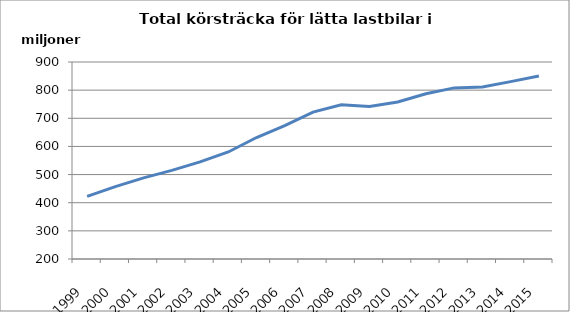
| Category | Series 0 |
|---|---|
| 1999.0 | 422257663.4 |
| 2000.0 | 457395257.8 |
| 2001.0 | 488193162.8 |
| 2002.0 | 514755393.5 |
| 2003.0 | 545141383.5 |
| 2004.0 | 580338676.2 |
| 2005.0 | 631604271.8 |
| 2006.0 | 674180412.5 |
| 2007.0 | 722000073.4 |
| 2008.0 | 748186336.2 |
| 2009.0 | 742110599.7 |
| 2010.0 | 757725514.2 |
| 2011.0 | 787023975 |
| 2012.0 | 808048451 |
| 2013.0 | 810917728 |
| 2014.0 | 830330963.4 |
| 2015.0 | 850273283.5 |